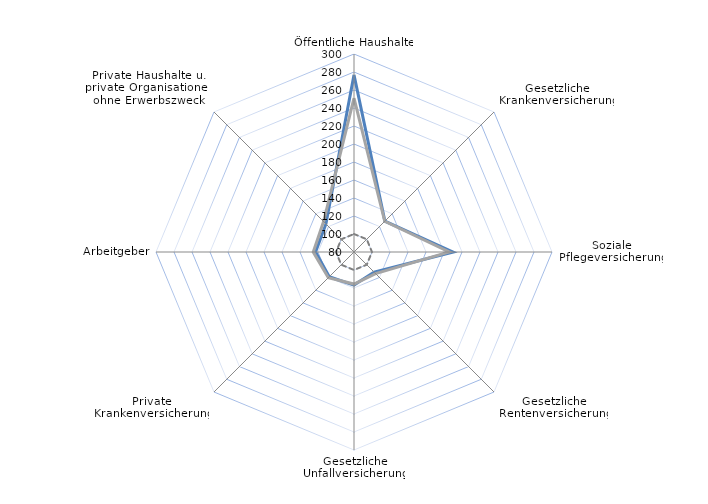
| Category | Baden-Württemberg - Summe von Messzahl | Baden-Württemberg - Summe von Deutschland | Baden-Württemberg - Summe von Ref |
|---|---|---|---|
| Öffentliche Haushalte | 276.8 | 251 | 100 |
| Gesetzliche Krankenversicherung | 128.5 | 128.3 | 100 |
| Soziale Pflegeversicherung | 190.1 | 185.8 | 100 |
| Gesetzliche Rentenversicherung | 111.6 | 113.9 | 100 |
| Gesetzliche Unfallversicherung | 116.8 | 115.6 | 100 |
| Private Krankenversicherung | 118.9 | 120.3 | 100 |
| Arbeitgeber | 122.7 | 125.3 | 100 |
| Private Haushalte u. private Organisationen ohne Erwerbszweck | 124.1 | 127.8 | 100 |